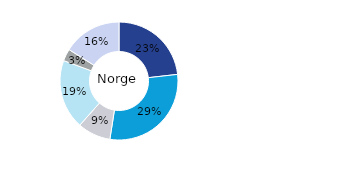
| Category | Norge |
|---|---|
| Kontor | 0.232 |
| Bostäder | 0.293 |
| Handel | 0.091 |
| Logistik* | 0.191 |
| Samhällsfastigheter** | 0.033 |
| Övrigt | 0.161 |